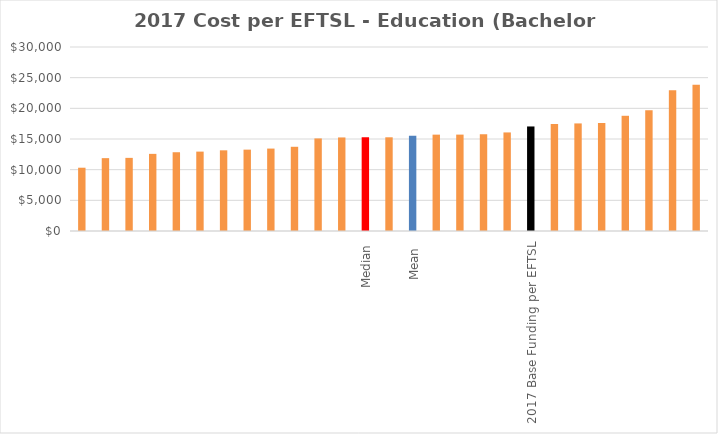
| Category | Series 0 |
|---|---|
|  | 10317.436 |
|  | 11879.49 |
|  | 11922.71 |
|  | 12576.034 |
|  | 12841.451 |
|  | 12944.353 |
|  | 13154.019 |
|  | 13266.178 |
|  | 13438.04 |
|  | 13731.049 |
|  | 15092.491 |
|  | 15254.209 |
| Median | 15265.416 |
|  | 15277.84 |
| Mean  | 15524 |
|  | 15710.854 |
|  | 15716.012 |
|  | 15783.012 |
|  | 16071.329 |
| 2017 Base Funding per EFTSL | 17044 |